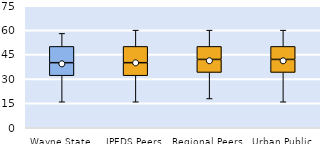
| Category | 25th | 50th | 75th |
|---|---|---|---|
| Wayne State | 32 | 8 | 10 |
| IPEDS Peers | 32 | 8 | 10 |
| Regional Peers | 34 | 8 | 8 |
| Urban Public | 34 | 8 | 8 |